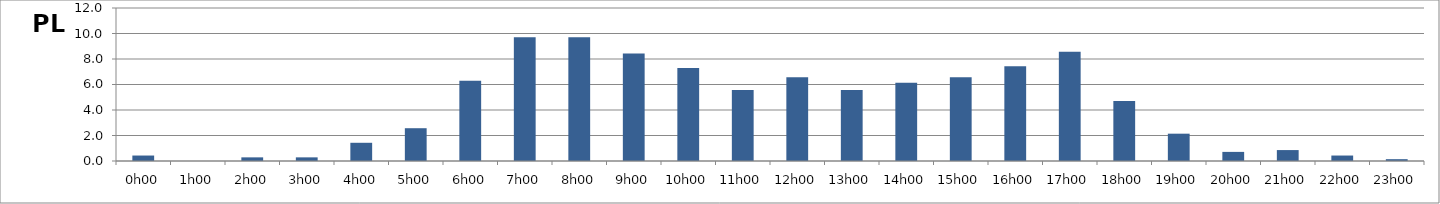
| Category | PL |
|---|---|
| 0.0 | 0.429 |
| 0.041666666666666664 | 0 |
| 0.08333333333333333 | 0.286 |
| 0.125 | 0.286 |
| 0.16666666666666666 | 1.429 |
| 0.20833333333333334 | 2.571 |
| 0.25 | 6.286 |
| 0.2916666666666667 | 9.714 |
| 0.3333333333333333 | 9.714 |
| 0.375 | 8.429 |
| 0.4166666666666667 | 7.286 |
| 0.4583333333333333 | 5.571 |
| 0.5 | 6.571 |
| 0.5416666666666666 | 5.571 |
| 0.5833333333333334 | 6.143 |
| 0.625 | 6.571 |
| 0.6666666666666666 | 7.429 |
| 0.7083333333333334 | 8.571 |
| 0.75 | 4.714 |
| 0.7916666666666666 | 2.143 |
| 0.8333333333333334 | 0.714 |
| 0.875 | 0.857 |
| 0.9166666666666666 | 0.429 |
| 0.9583333333333334 | 0.143 |